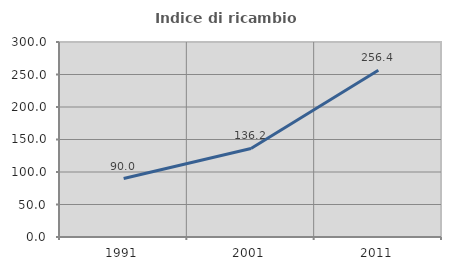
| Category | Indice di ricambio occupazionale  |
|---|---|
| 1991.0 | 90 |
| 2001.0 | 136.184 |
| 2011.0 | 256.391 |